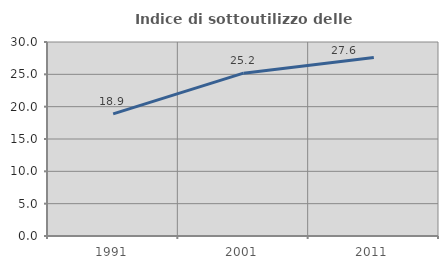
| Category | Indice di sottoutilizzo delle abitazioni  |
|---|---|
| 1991.0 | 18.88 |
| 2001.0 | 25.185 |
| 2011.0 | 27.616 |